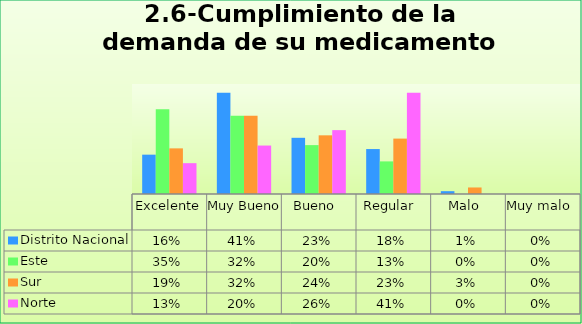
| Category | Distrito Nacional | Este | Sur  | Norte |
|---|---|---|---|---|
| Excelente | 0.161 | 0.347 | 0.187 | 0.126 |
| Muy Bueno | 0.414 | 0.32 | 0.32 | 0.198 |
| Bueno  | 0.23 | 0.2 | 0.24 | 0.261 |
| Regular  | 0.184 | 0.133 | 0.227 | 0.414 |
| Malo  | 0.011 | 0 | 0.027 | 0 |
| Muy malo  | 0 | 0 | 0 | 0 |